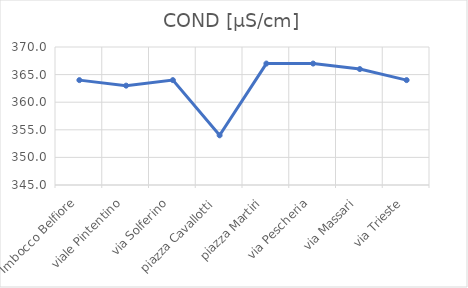
| Category | COND [µS/cm] |
|---|---|
| Imbocco Belfiore | 364 |
| viale Pintentino | 363 |
| via Solferino | 364 |
| piazza Cavallotti | 354 |
| piazza Martiri | 367 |
| via Pescheria | 367 |
| via Massari | 366 |
| via Trieste | 364 |